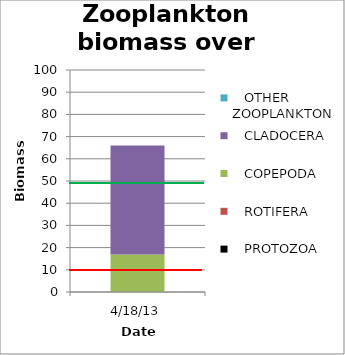
| Category |    PROTOZOA |    ROTIFERA |    COPEPODA |    CLADOCERA |    OTHER ZOOPLANKTON |
|---|---|---|---|---|---|
| 4/18/13 | 0 | 0.034 | 16.848 | 49.118 | 0 |